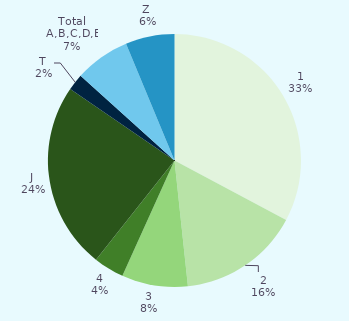
| Category | Series 0 |
|---|---|
| 1 | 0.328 |
| 2 | 0.155 |
| 3 | 0.084 |
| 4 | 0.039 |
| J  | 0.239 |
| T  | 0.021 |
| Total A,B,C,D,E | 0.071 |
| Z  | 0.063 |